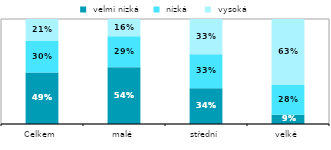
| Category |  velmi nízká |  nízká  |  vysoká |
|---|---|---|---|
| Celkem | 0.491 | 0.299 | 0.21 |
| malé | 0.542 | 0.295 | 0.164 |
| střední | 0.339 | 0.326 | 0.335 |
| velké | 0.088 | 0.283 | 0.628 |